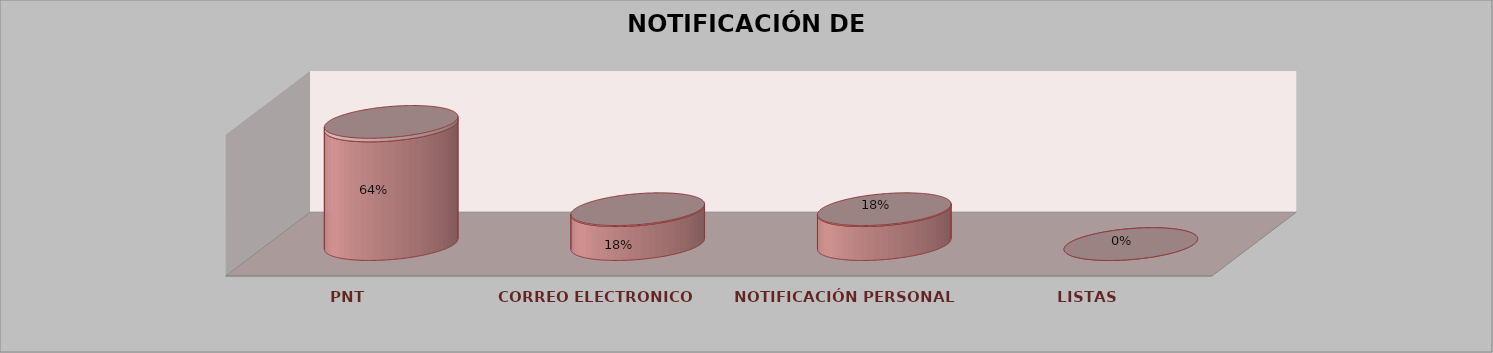
| Category | Series 0 | Series 1 | Series 2 | Series 3 | Series 4 |
|---|---|---|---|---|---|
| PNT |  |  |  | 21 | 0.636 |
| CORREO ELECTRONICO |  |  |  | 6 | 0.182 |
| NOTIFICACIÓN PERSONAL |  |  |  | 6 | 0.182 |
| LISTAS |  |  |  | 0 | 0 |